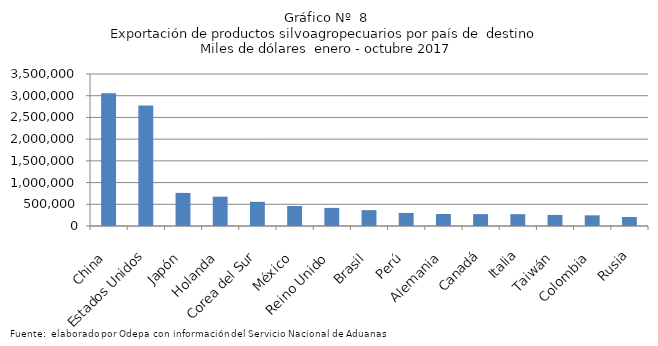
| Category | Series 0 |
|---|---|
| China | 3059458.863 |
| Estados Unidos | 2774444.348 |
| Japón | 761787.366 |
| Holanda | 675363.226 |
| Corea del Sur | 556989.055 |
| México | 460981.968 |
| Reino Unido | 416484.983 |
| Brasil | 365596.778 |
| Perú | 301437.17 |
| Alemania | 276521.351 |
| Canadá | 273169.405 |
| Italia | 272347.51 |
| Taiwán | 254842.55 |
| Colombia | 245952.138 |
| Rusia | 207824.791 |